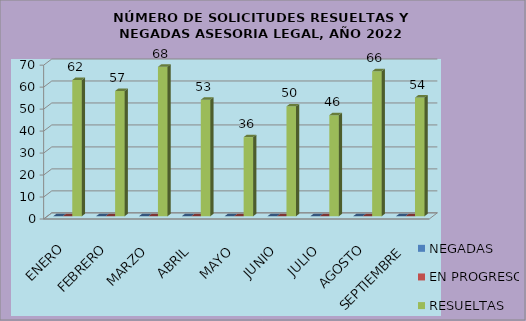
| Category | NEGADAS | EN PROGRESO | RESUELTAS |
|---|---|---|---|
| ENERO | 0 | 0 | 62 |
| FEBRERO | 0 | 0 | 57 |
| MARZO | 0 | 0 | 68 |
| ABRIL | 0 | 0 | 53 |
| MAYO | 0 | 0 | 36 |
| JUNIO | 0 | 0 | 50 |
| JULIO | 0 | 0 | 46 |
| AGOSTO | 0 | 0 | 66 |
| SEPTIEMBRE | 0 | 0 | 54 |